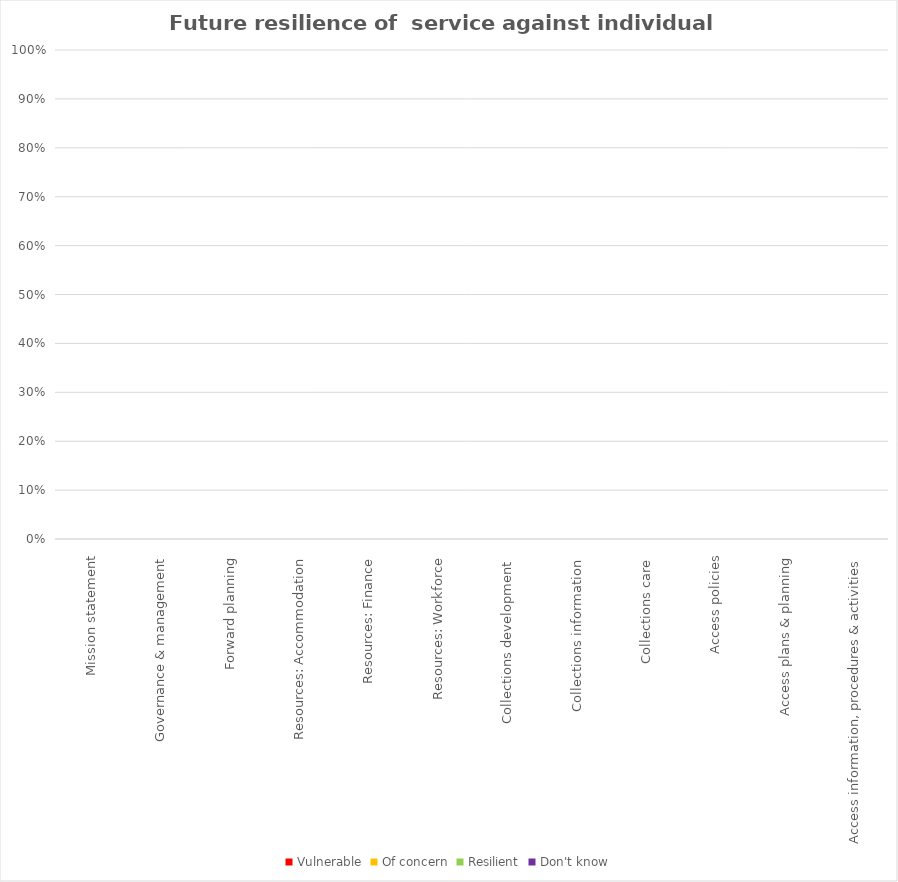
| Category | Vulnerable | Of concern | Resilient | Don't know |
|---|---|---|---|---|
| Mission statement | 0 | 0 | 0 | 0 |
| Governance & management | 0 | 0 | 0 | 0 |
| Forward planning | 0 | 0 | 0 | 0 |
| Resources: Accommodation | 0 | 0 | 0 | 0 |
| Resources: Finance | 0 | 0 | 0 | 0 |
| Resources: Workforce | 0 | 0 | 0 | 0 |
| Collections development  | 0 | 0 | 0 | 0 |
| Collections information  | 0 | 0 | 0 | 0 |
| Collections care  | 0 | 0 | 0 | 0 |
| Access policies | 0 | 0 | 0 | 0 |
| Access plans & planning | 0 | 0 | 0 | 0 |
| Access information, procedures & activities | 0 | 0 | 0 | 0 |